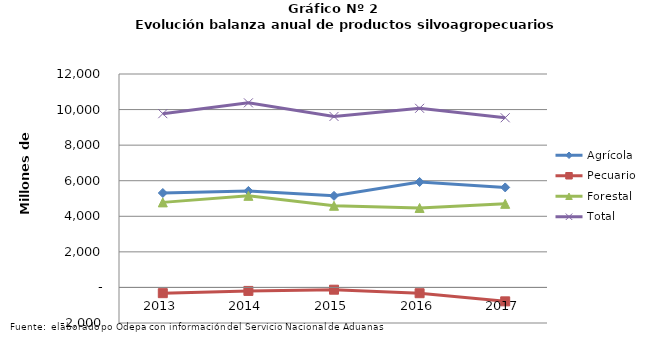
| Category | Agrícola | Pecuario | Forestal | Total |
|---|---|---|---|---|
| 2013.0 | 5309603 | -322473 | 4781973 | 9769103 |
| 2014.0 | 5424524 | -195643 | 5149868 | 10378749 |
| 2015.0 | 5149872 | -127785 | 4591408 | 9613495 |
| 2016.0 | 5928552 | -325380 | 4468104 | 10071276 |
| 2017.0 | 5622747 | -782960 | 4700192 | 9539979 |